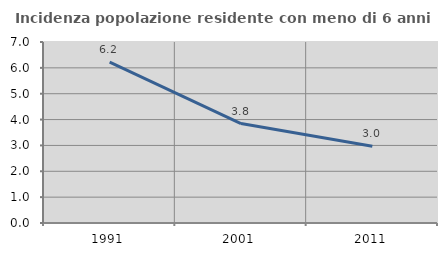
| Category | Incidenza popolazione residente con meno di 6 anni |
|---|---|
| 1991.0 | 6.218 |
| 2001.0 | 3.846 |
| 2011.0 | 2.97 |